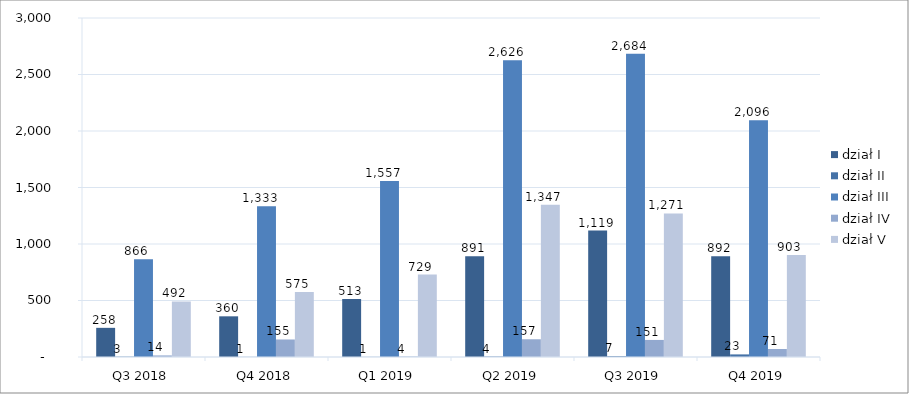
| Category | dział I | dział II | dział III | dział IV | dział V |
|---|---|---|---|---|---|
| Q3 2018 | 258 | 3 | 866 | 14 | 492 |
| Q4 2018 | 360 | 1 | 1333 | 155 | 575 |
| Q1 2019 | 513 | 1 | 1557 | 4 | 729 |
| Q2 2019 | 891 | 4 | 2626 | 157 | 1347 |
| Q3 2019 | 1119 | 7 | 2684 | 151 | 1271 |
| Q4 2019 | 892 | 23 | 2096 | 71 | 903 |